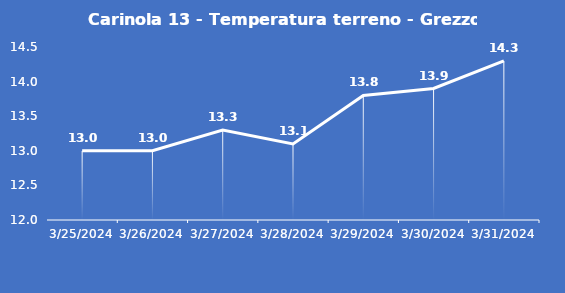
| Category | Carinola 13 - Temperatura terreno - Grezzo (°C) |
|---|---|
| 3/25/24 | 13 |
| 3/26/24 | 13 |
| 3/27/24 | 13.3 |
| 3/28/24 | 13.1 |
| 3/29/24 | 13.8 |
| 3/30/24 | 13.9 |
| 3/31/24 | 14.3 |